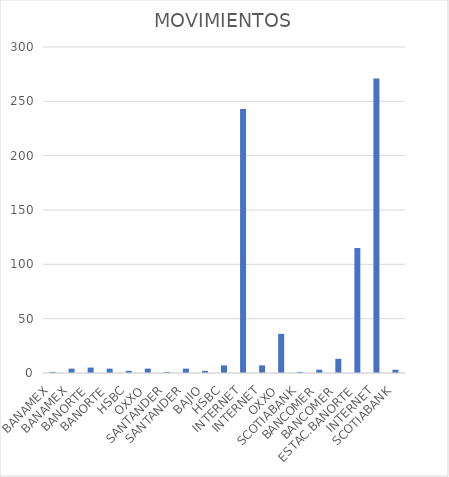
| Category | MOVIMIENTOS |
|---|---|
| BANAMEX | 1 |
| BANAMEX | 4 |
| BANORTE | 5 |
| BANORTE | 4 |
| HSBC | 2 |
| OXXO | 4 |
| SANTANDER | 1 |
| SANTANDER | 4 |
| BAJIO | 2 |
| HSBC | 7 |
| INTERNET | 243 |
| INTERNET | 7 |
| OXXO | 36 |
| SCOTIABANK | 1 |
| BANCOMER | 3 |
| BANCOMER | 13 |
| ESTAC.BANORTE | 115 |
| INTERNET | 271 |
| SCOTIABANK | 3 |